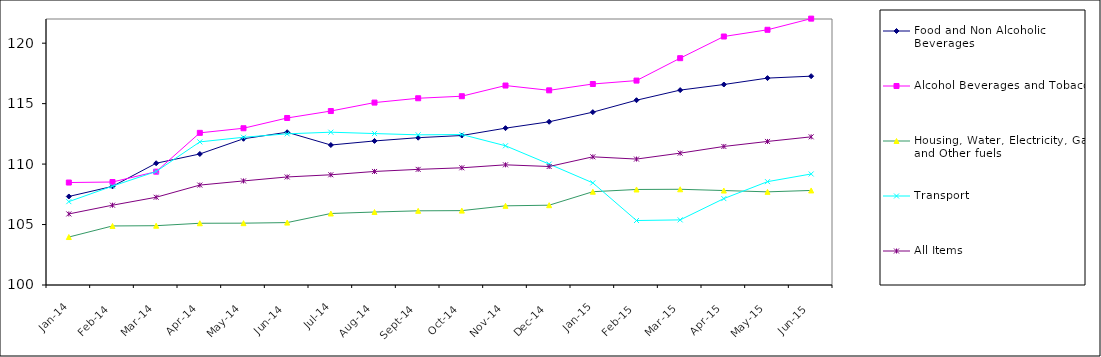
| Category | Food and Non Alcoholic Beverages | Alcohol Beverages and Tobacco | Housing, Water, Electricity, Gas and Other fuels | Transport | All Items  |
|---|---|---|---|---|---|
| 2014-01-01 | 107.321 | 108.474 | 103.967 | 106.895 | 105.878 |
| 2014-02-01 | 108.156 | 108.519 | 104.883 | 108.18 | 106.601 |
| 2014-03-01 | 110.07 | 109.373 | 104.905 | 109.388 | 107.257 |
| 2014-04-01 | 110.836 | 112.583 | 105.106 | 111.837 | 108.264 |
| 2014-05-01 | 112.095 | 112.965 | 105.114 | 112.218 | 108.608 |
| 2014-06-01 | 112.634 | 113.813 | 105.162 | 112.502 | 108.936 |
| 2014-07-01 | 111.577 | 114.387 | 105.914 | 112.638 | 109.117 |
| 2014-08-01 | 111.915 | 115.087 | 106.036 | 112.525 | 109.391 |
| 2014-09-01 | 112.185 | 115.445 | 106.136 | 112.42 | 109.563 |
| 2014-10-01 | 112.363 | 115.614 | 106.151 | 112.444 | 109.694 |
| 2014-11-01 | 112.971 | 116.497 | 106.547 | 111.515 | 109.94 |
| 2014-12-01 | 113.5 | 116.1 | 106.6 | 110 | 109.8 |
| 2015-01-01 | 114.295 | 116.625 | 107.716 | 108.446 | 110.601 |
| 2015-02-01 | 115.283 | 116.906 | 107.901 | 105.333 | 110.415 |
| 2015-03-01 | 116.12 | 118.76 | 107.917 | 105.386 | 110.906 |
| 2015-04-01 | 116.582 | 120.552 | 107.812 | 107.146 | 111.458 |
| 2015-05-01 | 117.112 | 121.107 | 107.704 | 108.548 | 111.873 |
| 2015-06-01 | 117.271 | 122.03 | 107.821 | 109.182 | 112.254 |